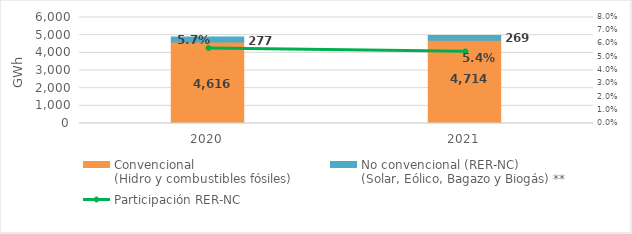
| Category | Convencional
(Hidro y combustibles fósiles) | No convencional (RER-NC)
(Solar, Eólico, Bagazo y Biogás) ** |
|---|---|---|
| 2020.0 | 4616.109 | 276.786 |
| 2021.0 | 4714.069 | 269.496 |